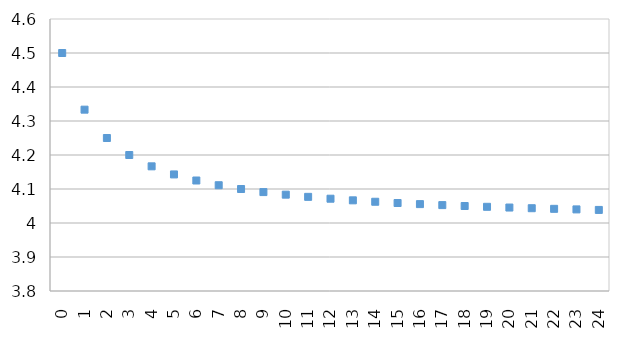
| Category | Series 0 |
|---|---|
| 0.0 | 4.5 |
| 1.0 | 4.333 |
| 2.0 | 4.25 |
| 3.0 | 4.2 |
| 4.0 | 4.167 |
| 5.0 | 4.143 |
| 6.0 | 4.125 |
| 7.0 | 4.111 |
| 8.0 | 4.1 |
| 9.0 | 4.091 |
| 10.0 | 4.083 |
| 11.0 | 4.077 |
| 12.0 | 4.071 |
| 13.0 | 4.067 |
| 14.0 | 4.062 |
| 15.0 | 4.059 |
| 16.0 | 4.056 |
| 17.0 | 4.053 |
| 18.0 | 4.05 |
| 19.0 | 4.048 |
| 20.0 | 4.045 |
| 21.0 | 4.043 |
| 22.0 | 4.042 |
| 23.0 | 4.04 |
| 24.0 | 4.038 |